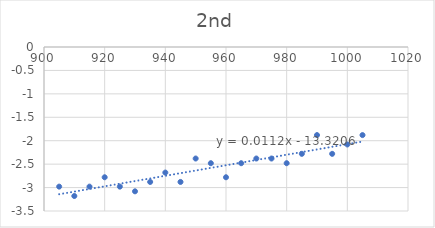
| Category | Series 0 |
|---|---|
| 905.0 | -2.98 |
| 910.0 | -3.18 |
| 915.0 | -2.98 |
| 920.0 | -2.78 |
| 925.0 | -2.98 |
| 930.0 | -3.08 |
| 935.0 | -2.88 |
| 940.0 | -2.68 |
| 945.0 | -2.88 |
| 950.0 | -2.38 |
| 955.0 | -2.48 |
| 960.0 | -2.78 |
| 965.0 | -2.48 |
| 970.0 | -2.38 |
| 975.0 | -2.38 |
| 980.0 | -2.48 |
| 985.0 | -2.28 |
| 990.0 | -1.88 |
| 995.0 | -2.28 |
| 1000.0 | -2.08 |
| 1005.0 | -1.88 |